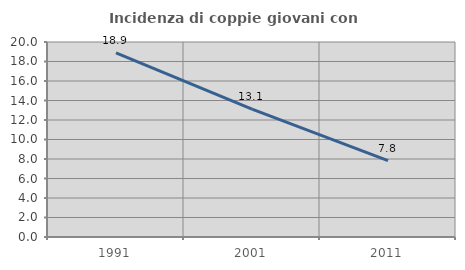
| Category | Incidenza di coppie giovani con figli |
|---|---|
| 1991.0 | 18.887 |
| 2001.0 | 13.11 |
| 2011.0 | 7.825 |